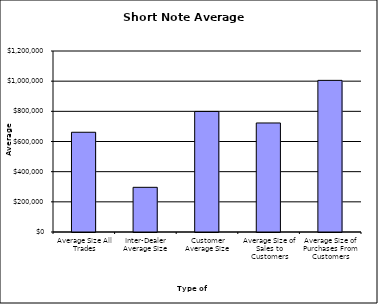
| Category | Security Type |
|---|---|
| Average Size All Trades | 661289.185 |
| Inter-Dealer Average Size | 296182.988 |
| Customer Average Size | 799169.169 |
| Average Size of Sales to Customers | 722774.306 |
| Average Size of Purchases From Customers | 1005307.263 |